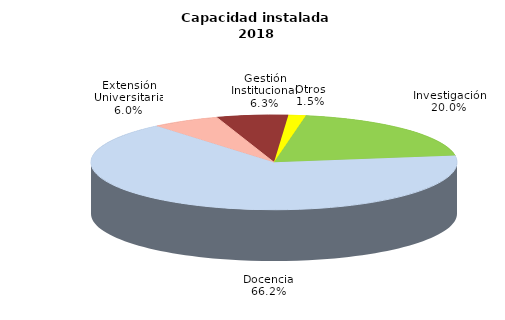
| Category | Series 0 |
|---|---|
| Investigación | 19.947 |
| Docencia | 66.223 |
| Extensión Universitaria | 5.984 |
| Gestión Institucional | 6.316 |
| Otros | 1.529 |